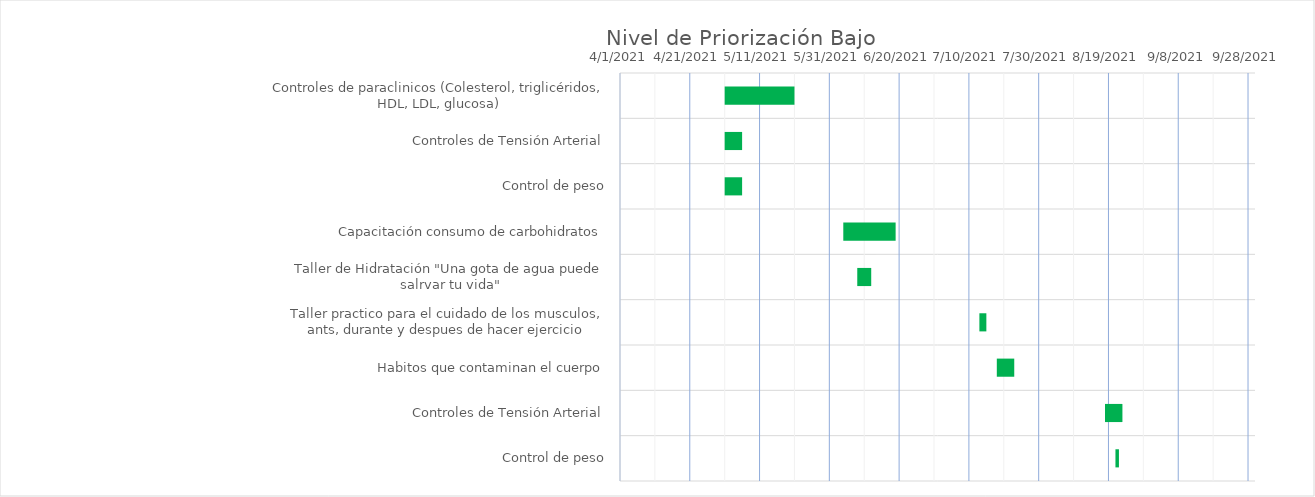
| Category | Series 0 | Series 1 |
|---|---|---|
| Controles de paraclinicos (Colesterol, triglicéridos, HDL, LDL, glucosa) | 5/1/21 | 20 |
| Controles de Tensión Arterial | 5/1/21 | 5 |
| Control de peso | 5/1/21 | 5 |
| Capacitación consumo de carbohidratos | 6/4/21 | 15 |
| Taller de Hidratación "Una gota de agua puede salrvar tu vida" | 6/8/21 | 4 |
| Taller practico para el cuidado de los musculos, ants, durante y despues de hacer ejercicio | 7/13/21 | 2 |
| Habitos que contaminan el cuerpo | 7/18/21 | 5 |
| Controles de Tensión Arterial | 8/18/21 | 5 |
| Control de peso | 8/21/21 | 1 |